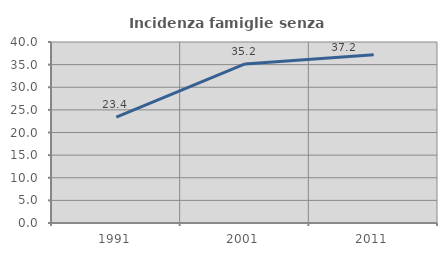
| Category | Incidenza famiglie senza nuclei |
|---|---|
| 1991.0 | 23.397 |
| 2001.0 | 35.159 |
| 2011.0 | 37.164 |